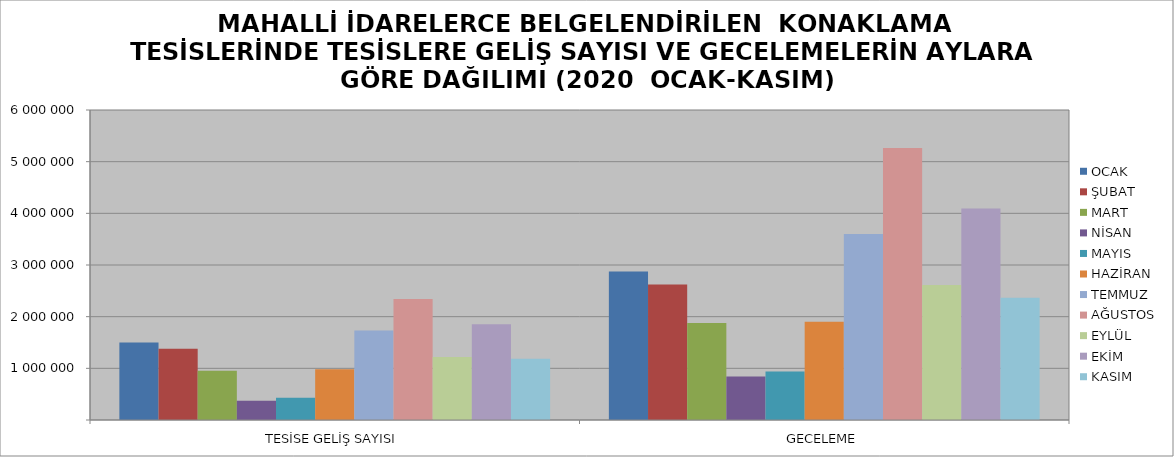
| Category | OCAK | ŞUBAT | MART | NİSAN | MAYIS | HAZİRAN | TEMMUZ | AĞUSTOS | EYLÜL | EKİM | KASIM |
|---|---|---|---|---|---|---|---|---|---|---|---|
| TESİSE GELİŞ SAYISI | 1497815 | 1380765 | 955554 | 372466 | 430328 | 981538 | 1730606 | 2342031 | 1217037 | 1851250 | 1184182 |
| GECELEME | 2872303 | 2621819 | 1878971 | 839735 | 939652 | 1902057 | 3601580 | 5263679 | 2612279 | 4093869 | 2364780 |